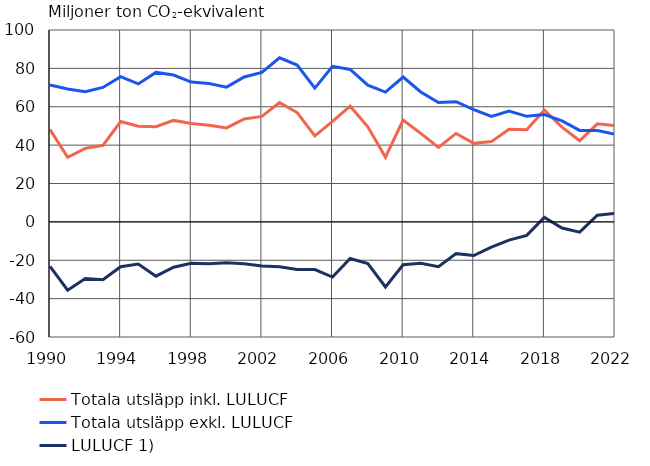
| Category | Totala utsläpp inkl. LULUCF | Totala utsläpp exkl. LULUCF | LULUCF 1) |
|---|---|---|---|
| 1990.0 | 48.156 | 71.331 | -23.175 |
| 1991.0 | 33.667 | 69.247 | -35.58 |
| 1992.0 | 38.322 | 67.869 | -29.547 |
| 1993.0 | 39.893 | 70.077 | -30.184 |
| 1994.0 | 52.275 | 75.646 | -23.37 |
| 1995.0 | 49.889 | 71.89 | -22 |
| 1996.0 | 49.574 | 77.881 | -28.307 |
| 1997.0 | 52.88 | 76.539 | -23.659 |
| 1998.0 | 51.253 | 72.846 | -21.594 |
| 1999.0 | 50.395 | 72.162 | -21.766 |
| 2000.0 | 48.962 | 70.22 | -21.258 |
| 2001.0 | 53.661 | 75.537 | -21.876 |
| 2002.0 | 54.986 | 77.935 | -22.949 |
| 2003.0 | 62.155 | 85.521 | -23.366 |
| 2004.0 | 56.969 | 81.757 | -24.788 |
| 2005.0 | 44.863 | 69.713 | -24.85 |
| 2006.0 | 52.338 | 81.085 | -28.748 |
| 2007.0 | 60.312 | 79.413 | -19.101 |
| 2008.0 | 49.578 | 71.26 | -21.682 |
| 2009.0 | 33.723 | 67.63 | -33.906 |
| 2010.0 | 53.09 | 75.468 | -22.378 |
| 2011.0 | 46.1 | 67.72 | -21.62 |
| 2012.0 | 38.835 | 62.177 | -23.342 |
| 2013.0 | 46.089 | 62.646 | -16.557 |
| 2014.0 | 40.92 | 58.461 | -17.541 |
| 2015.0 | 41.83 | 54.961 | -13.131 |
| 2016.0 | 48.318 | 57.81 | -9.493 |
| 2017.0 | 47.972 | 55.003 | -7.032 |
| 2018.0 | 58.258 | 55.934 | 2.324 |
| 2019.0 | 49.413 | 52.646 | -3.233 |
| 2020.0 | 42.299 | 47.654 | -5.354 |
| 2021.0 | 51.078 | 47.604 | 3.474 |
| 2022.0 | 50.143 | 45.7 | 4.443 |